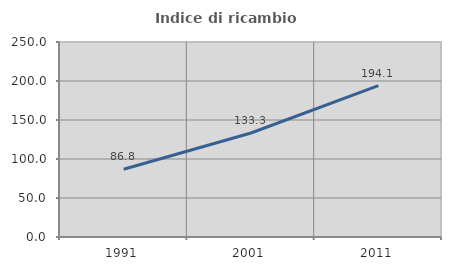
| Category | Indice di ricambio occupazionale  |
|---|---|
| 1991.0 | 86.842 |
| 2001.0 | 133.333 |
| 2011.0 | 194.118 |